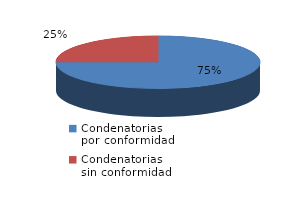
| Category | Series 0 |
|---|---|
| 0 | 18 |
| 1 | 6 |